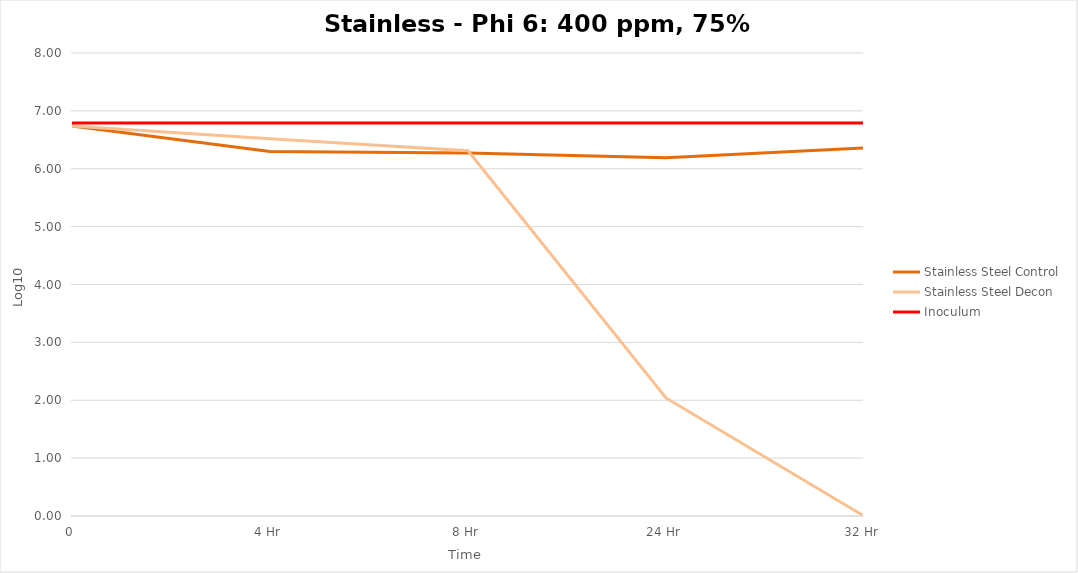
| Category | Stainless Steel Control | Stainless Steel Decon | Inoculum |
|---|---|---|---|
| 0 | 6.74 | 6.74 | 6.79 |
| 4 Hr | 6.3 | 6.52 | 6.79 |
| 8 Hr | 6.27 | 6.31 | 6.79 |
| 24 Hr | 6.19 | 2.04 | 6.79 |
| 32 Hr | 6.36 | 0 | 6.79 |